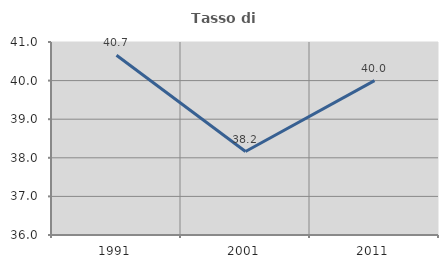
| Category | Tasso di occupazione   |
|---|---|
| 1991.0 | 40.656 |
| 2001.0 | 38.163 |
| 2011.0 | 40 |